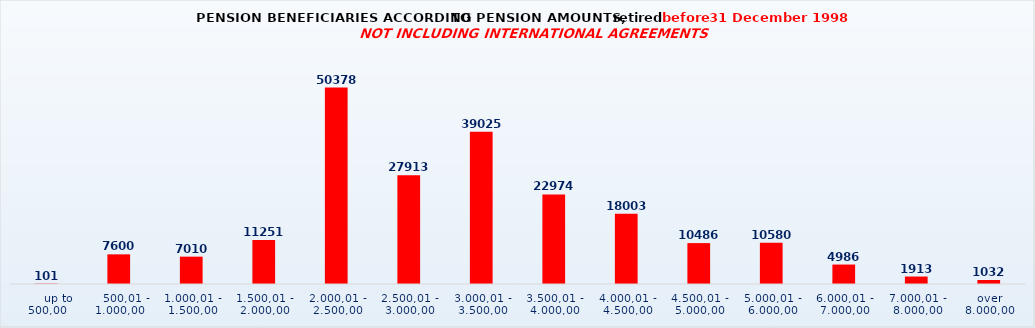
| Category | Series 0 |
|---|---|
|      up to 500,00 | 101 |
|    500,01 - 1.000,00 | 7600 |
| 1.000,01 - 1.500,00 | 7010 |
| 1.500,01 - 2.000,00 | 11251 |
| 2.000,01 - 2.500,00 | 50378 |
| 2.500,01 - 3.000,00 | 27913 |
| 3.000,01 - 3.500,00 | 39025 |
| 3.500,01 - 4.000,00 | 22974 |
| 4.000,01 - 4.500,00 | 18003 |
| 4.500,01 - 5.000,00 | 10486 |
| 5.000,01 - 6.000,00 | 10580 |
| 6.000,01 - 7.000,00 | 4986 |
| 7.000,01 - 8.000,00 | 1913 |
| over 8.000,00 | 1032 |